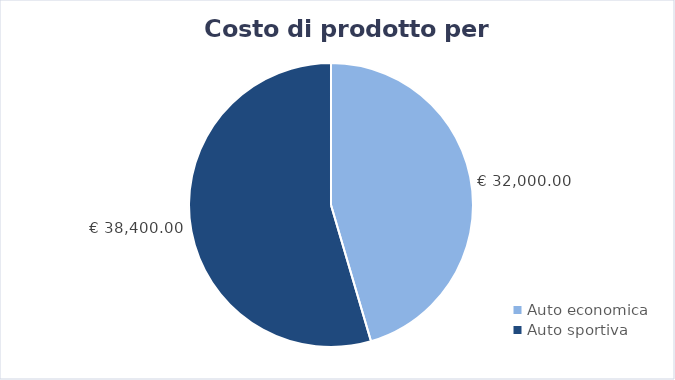
| Category | Series 0 |
|---|---|
| Auto economica | 32000 |
| Auto sportiva | 38400 |